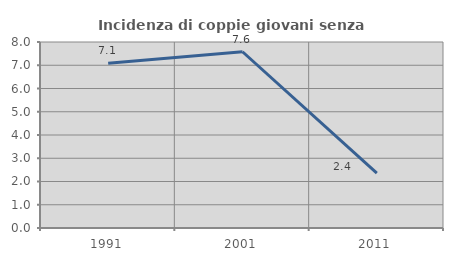
| Category | Incidenza di coppie giovani senza figli |
|---|---|
| 1991.0 | 7.09 |
| 2001.0 | 7.58 |
| 2011.0 | 2.361 |